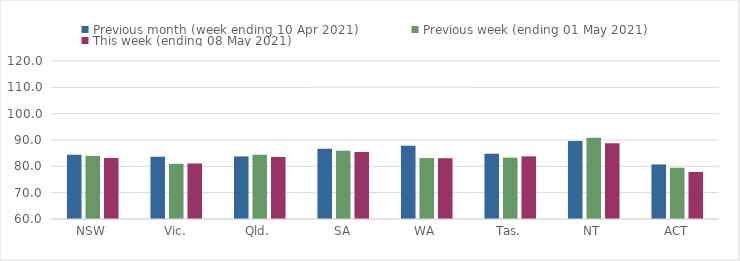
| Category | Previous month (week ending 10 Apr 2021) | Previous week (ending 01 May 2021) | This week (ending 08 May 2021) |
|---|---|---|---|
| NSW | 84.4 | 83.97 | 83.17 |
| Vic. | 83.65 | 80.96 | 81.08 |
| Qld. | 83.77 | 84.41 | 83.57 |
| SA | 86.66 | 85.94 | 85.4 |
| WA | 87.84 | 83.14 | 83.08 |
| Tas. | 84.8 | 83.31 | 83.79 |
| NT | 89.58 | 90.9 | 88.8 |
| ACT | 80.72 | 79.45 | 77.87 |